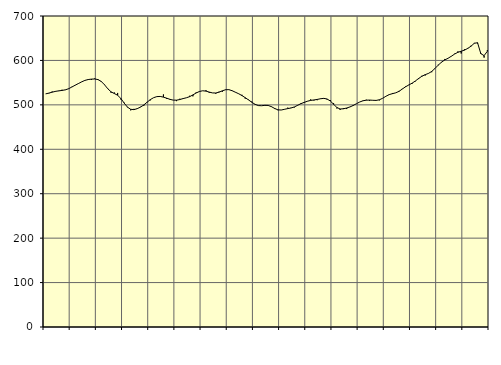
| Category | Piggar | Series 1 |
|---|---|---|
| nan | 524.6 | 524.71 |
| 87.0 | 525.9 | 526.51 |
| 87.0 | 530 | 528.54 |
| 87.0 | 529.6 | 530.32 |
| nan | 531 | 531.52 |
| 88.0 | 534 | 532.47 |
| 88.0 | 533.3 | 533.77 |
| 88.0 | 535.7 | 536.25 |
| nan | 540.6 | 540.06 |
| 89.0 | 543.9 | 544.14 |
| 89.0 | 547.3 | 547.87 |
| 89.0 | 551.5 | 551.7 |
| nan | 555.4 | 555.05 |
| 90.0 | 557.7 | 556.99 |
| 90.0 | 556.3 | 557.95 |
| 90.0 | 559.4 | 558.21 |
| nan | 557.6 | 556.9 |
| 91.0 | 551.7 | 552.66 |
| 91.0 | 545.8 | 545.16 |
| 91.0 | 535.7 | 536.21 |
| nan | 527.2 | 529.28 |
| 92.0 | 527.8 | 525.47 |
| 92.0 | 526.8 | 521.62 |
| 92.0 | 512 | 514.27 |
| nan | 504.8 | 504 |
| 93.0 | 494.2 | 494.96 |
| 93.0 | 487.6 | 489.99 |
| 93.0 | 491 | 489.26 |
| nan | 492.3 | 491.47 |
| 94.0 | 495.5 | 494.99 |
| 94.0 | 497.9 | 499.77 |
| 94.0 | 506.6 | 505.88 |
| nan | 510.1 | 511.85 |
| 95.0 | 516.1 | 516.17 |
| 95.0 | 518.6 | 518.57 |
| 95.0 | 519.1 | 518.92 |
| nan | 523.4 | 517.39 |
| 96.0 | 513.2 | 515.04 |
| 96.0 | 513.1 | 512.44 |
| 96.0 | 510.6 | 510.65 |
| nan | 508.4 | 510.54 |
| 97.0 | 513.7 | 511.96 |
| 97.0 | 514.5 | 514.11 |
| 97.0 | 515.8 | 515.91 |
| nan | 520.4 | 518.43 |
| 98.0 | 519.2 | 522.37 |
| 98.0 | 528 | 526.69 |
| 98.0 | 530.7 | 530.13 |
| nan | 531.8 | 531.71 |
| 99.0 | 532.9 | 530.93 |
| 99.0 | 527.1 | 528.75 |
| 99.0 | 526.8 | 526.88 |
| nan | 525.1 | 526.68 |
| 0.0 | 529.6 | 528.57 |
| 0.0 | 529.4 | 531.58 |
| 0.0 | 533.6 | 534.07 |
| nan | 534.5 | 534.24 |
| 1.0 | 532.2 | 531.79 |
| 1.0 | 528.8 | 528.44 |
| 1.0 | 525.3 | 525 |
| nan | 522.6 | 520.9 |
| 2.0 | 514 | 516.16 |
| 2.0 | 511.8 | 511.12 |
| 2.0 | 507.4 | 505.92 |
| nan | 500.5 | 501.24 |
| 3.0 | 498 | 498.41 |
| 3.0 | 498.2 | 498.04 |
| 3.0 | 498.1 | 498.89 |
| nan | 498.9 | 498.66 |
| 4.0 | 496.5 | 495.98 |
| 4.0 | 490.6 | 491.85 |
| 4.0 | 487.9 | 488.79 |
| nan | 488.5 | 488.38 |
| 5.0 | 490.3 | 489.98 |
| 5.0 | 493.7 | 491.57 |
| 5.0 | 493.4 | 492.95 |
| nan | 494.2 | 495.28 |
| 6.0 | 499.6 | 498.91 |
| 6.0 | 503.6 | 502.62 |
| 6.0 | 504.2 | 505.51 |
| nan | 507.9 | 508.18 |
| 7.0 | 512.3 | 510.05 |
| 7.0 | 509.9 | 511.01 |
| 7.0 | 510.5 | 512.21 |
| nan | 514.2 | 513.73 |
| 8.0 | 515.3 | 514.6 |
| 8.0 | 512.1 | 513.25 |
| 8.0 | 510.7 | 508.71 |
| nan | 503.9 | 501.49 |
| 9.0 | 491.9 | 494.07 |
| 9.0 | 488.7 | 490.74 |
| 9.0 | 492.7 | 491.1 |
| nan | 490.6 | 492.9 |
| 10.0 | 495.1 | 495.29 |
| 10.0 | 497.5 | 498.61 |
| 10.0 | 502.5 | 502.64 |
| nan | 506.4 | 506.44 |
| 11.0 | 509.6 | 509.22 |
| 11.0 | 511.5 | 510.51 |
| 11.0 | 509.2 | 510.77 |
| nan | 510.2 | 510.29 |
| 12.0 | 510.6 | 510.01 |
| 12.0 | 510.1 | 511.46 |
| 12.0 | 514.8 | 514.8 |
| nan | 519.3 | 519.31 |
| 13.0 | 522.4 | 523.06 |
| 13.0 | 526.7 | 525.22 |
| 13.0 | 527 | 527.1 |
| nan | 531.4 | 530.41 |
| 14.0 | 536.2 | 535.61 |
| 14.0 | 541.7 | 540.67 |
| 14.0 | 545.1 | 544.74 |
| nan | 547.4 | 548.81 |
| 15.0 | 553 | 553.76 |
| 15.0 | 558 | 559.45 |
| 15.0 | 565.5 | 564.36 |
| nan | 566.1 | 567.98 |
| 16.0 | 570.4 | 570.78 |
| 16.0 | 573.5 | 575.23 |
| 16.0 | 582.4 | 582 |
| nan | 590.5 | 589.49 |
| 17.0 | 595.5 | 596.2 |
| 17.0 | 603.3 | 601.13 |
| 17.0 | 605.1 | 604.93 |
| nan | 609.8 | 609.46 |
| 18.0 | 615.1 | 614.38 |
| 18.0 | 620.3 | 618.29 |
| 18.0 | 615.6 | 620.73 |
| nan | 625.1 | 623.14 |
| 19.0 | 628.1 | 627.02 |
| 19.0 | 633.1 | 631.99 |
| 19.0 | 639.4 | 638.57 |
| nan | 638 | 639.86 |
| 20.0 | 616.7 | 615.29 |
| 20.0 | 606.4 | 610.8 |
| 20.0 | 623.2 | 620.67 |